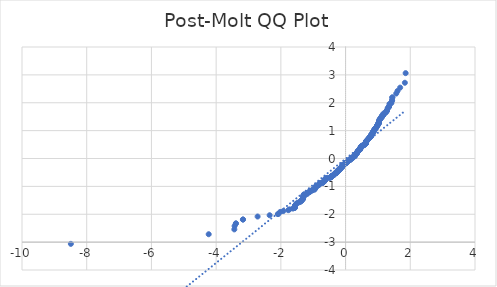
| Category | Series 0 |
|---|---|
| -0.018582954644452636 | -0.183 |
| -0.10750043838775823 | -0.273 |
| 0.8544250675625532 | 0.97 |
| 0.2643363118115212 | 0.077 |
| 0.4017542412329956 | 0.285 |
| -0.27725199826134206 | -0.512 |
| 0.3936708336199659 | 0.273 |
| 0.7089237305280515 | 0.704 |
| -0.964341645368707 | -1.112 |
| -0.32575244393950853 | -0.531 |
| 0.8948421056276923 | 1.053 |
| 0.3694206107808838 | 0.233 |
| -0.43892015052189853 | -0.649 |
| 0.8382582523364962 | 0.927 |
| 0.7412573609801633 | 0.754 |
| -0.0913336231617035 | -0.251 |
| -0.36616948200464766 | -0.589 |
| 0.04608430625977087 | -0.133 |
| -0.9562582377556796 | -1.092 |
| 1.0080098122100822 | 1.245 |
| -0.28533540587436945 | -0.518 |
| -0.6410053408475941 | -0.777 |
| -0.36616948200464766 | -0.589 |
| 0.8705918827886079 | 0.979 |
| 0.9352591436928315 | 1.092 |
| -1.3361783955679876 | -1.482 |
| 0.34517038794179944 | 0.188 |
| 0.6280896543977732 | 0.589 |
| 0.8140080294974141 | 0.861 |
| 0.4987551325893285 | 0.438 |
| 1.0322600350491644 | 1.333 |
| 0.9514259589188861 | 1.123 |
| -1.5705972163457937 | -1.769 |
| -0.08325021554867384 | -0.233 |
| 0.6200062467847459 | 0.531 |
| -0.4227533352958438 | -0.622 |
| 0.9029255132407197 | 1.063 |
| 0.9756761817579706 | 1.176 |
| 0.44217127929813466 | 0.319 |
| -0.8511739387863171 | -0.962 |
| 0.7735909914322749 | 0.784 |
| -1.3038447651158758 | -1.375 |
| 0.8382582523364962 | 0.927 |
| 0.36133720316785645 | 0.222 |
| 0.4987551325893285 | 0.438 |
| -0.6814223789127333 | -0.83 |
| -3.389363929277054 | -2.33 |
| 0.9352591436928315 | 1.092 |
| -0.36616948200464766 | -0.589 |
| -2.087935303579575 | -1.994 |
| 0.3047533498766603 | 0.138 |
| 0.3047533498766603 | 0.138 |
| -0.05091658509656439 | -0.217 |
| 0.11075156716399208 | -0.061 |
| 1.4121801928614734 | 1.994 |
| 0.4987551325893285 | 0.438 |
| 0.029917491033713845 | -0.149 |
| -0.6410053408475941 | -0.777 |
| 1.1615945568576092 | 1.551 |
| 0.11075156716399208 | -0.061 |
| 1.1050107035664152 | 1.465 |
| -1.5220967706676274 | -1.629 |
| -0.6410053408475941 | -0.777 |
| 1.8325173887389195 | 2.717 |
| 0.5553389858805223 | 0.474 |
| -0.1155838460007856 | -0.308 |
| -0.002416139418395611 | -0.172 |
| 0.23200268135940944 | 0.044 |
| 0.3047533498766603 | 0.138 |
| 1.024176627436137 | 1.269 |
| 0.07033452909885296 | -0.088 |
| 0.27241971942454857 | 0.094 |
| -0.27725199826134206 | -0.512 |
| 1.4364304157005556 | 2.082 |
| 0.6685066924629124 | 0.649 |
| 0.44217127929813466 | 0.319 |
| 0.8463416599495258 | 0.944 |
| 1.1050107035664152 | 1.465 |
| 0.2966699422636329 | 0.105 |
| 0.062251121485825595 | -0.116 |
| 0.8705918827886079 | 0.979 |
| 0.3047533498766603 | 0.138 |
| 0.7816743990453023 | 0.822 |
| -0.7056726017518177 | -0.869 |
| 1.6061819755741393 | 2.423 |
| 0.6280896543977732 | 0.589 |
| -0.13175066122684262 | -0.319 |
| -0.6490887484606215 | -0.807 |
| 0.3775040183939112 | 0.262 |
| -0.10750043838775823 | -0.273 |
| -0.7703398626560388 | -0.877 |
| 0.2966699422636329 | 0.105 |
| 0.6846735076889694 | 0.676 |
| -0.14791747645289735 | -0.325 |
| -0.24491836780923032 | -0.444 |
| -8.48999413309761 | -3.062 |
| -1.6271810696369888 | -1.796 |
| 1.0403434426621918 | 1.375 |
| 0.5795892087196067 | 0.493 |
| -1.4331792869243218 | -1.57 |
| -0.6410053408475941 | -0.777 |
| 0.22391927374638207 | 0.028 |
| -0.6490887484606215 | -0.807 |
| 0.6846735076889694 | 0.676 |
| -0.1155838460007856 | -0.308 |
| 0.7089237305280515 | 0.704 |
| 0.9029255132407197 | 1.063 |
| 0.34517038794179944 | 0.188 |
| 0.9514259589188861 | 1.123 |
| -0.32575244393950853 | -0.531 |
| 0.15925201284216087 | -0.028 |
| 0.9837595893709979 | 1.198 |
| -0.9562582377556796 | -1.092 |
| 0.7089237305280515 | 0.704 |
| -0.6490887484606215 | -0.807 |
| 0.7735909914322749 | 0.784 |
| 0.7897578066583297 | 0.846 |
| 0.886758698014665 | 1.015 |
| 0.4098376488460229 | 0.296 |
| 0.7735909914322749 | 0.784 |
| 1.024176627436137 | 1.269 |
| 0.15925201284216087 | -0.028 |
| 0.3775040183939112 | 0.262 |
| -0.38233629723070467 | -0.602 |
| -1.9262671513190186 | -1.886 |
| -0.23683496019620295 | -0.42 |
| 0.7816743990453023 | 0.822 |
| -0.16408429167895208 | -0.36 |
| -0.46317037336098293 | -0.676 |
| -0.6248385256215394 | -0.747 |
| 1.3394295243442227 | 1.854 |
| 0.4825883173632738 | 0.426 |
| -0.18025110690500912 | -0.402 |
| -0.6733389712997059 | -0.822 |
| -0.8188403083342076 | -0.936 |
| 0.4987551325893285 | 0.438 |
| -0.10750043838775823 | -0.273 |
| 0.3694206107808838 | 0.233 |
| -0.8430905311732897 | -0.953 |
| -0.9562582377556796 | -1.092 |
| -0.36616948200464766 | -0.589 |
| 0.8705918827886079 | 0.979 |
| 0.33708698032877205 | 0.183 |
| -0.6248385256215394 | -0.747 |
| 0.4583380945241894 | 0.366 |
| 0.45025468691116205 | 0.354 |
| 0.5230053554284129 | 0.462 |
| -0.058999992709591755 | -0.222 |
| 0.2400860889724391 | 0.055 |
| 0.15925201284216087 | -0.028 |
| 0.6200062467847459 | 0.531 |
| -0.8188403083342076 | -0.936 |
| -1.2957613575028486 | -1.32 |
| -0.18025110690500912 | -0.402 |
| 0.16733542045518823 | 0.006 |
| -0.44700355813492587 | -0.669 |
| -0.2610851830352873 | -0.481 |
| 0.4583380945241894 | 0.366 |
| -0.1155838460007856 | -0.308 |
| -0.487420596200065 | -0.69 |
| -1.1825936509204598 | -1.257 |
| 0.4745049097502441 | 0.414 |
| -0.6895057865257606 | -0.853 |
| -1.3038447651158758 | -1.375 |
| 0.24816949658546644 | 0.072 |
| 0.4583380945241894 | 0.366 |
| 0.5795892087196067 | 0.493 |
| -0.2610851830352873 | -0.481 |
| -1.4897631402155156 | -1.589 |
| -1.3765954336331268 | -1.533 |
| -1.3038447651158758 | -1.375 |
| -0.8835075692384288 | -0.988 |
| -0.5763380799433729 | -0.704 |
| 1.444513823313583 | 2.189 |
| -1.3200115803419317 | -1.449 |
| 0.5553389858805223 | 0.474 |
| -1.3119281727289043 | -1.419 |
| 0.9190923284667745 | 1.082 |
| -1.7322653686063503 | -1.824 |
| -0.7056726017518177 | -0.869 |
| -3.1711119237253036 | -2.189 |
| -0.9562582377556796 | -1.092 |
| -0.9562582377556796 | -1.092 |
| -0.02666636225748 | -0.194 |
| -0.487420596200065 | -0.69 |
| -0.9562582377556796 | -1.092 |
| 0.16733542045518823 | 0.006 |
| -0.6248385256215394 | -0.747 |
| 0.15925201284216087 | -0.028 |
| -0.0913336231617035 | -0.251 |
| 0.886758698014665 | 1.015 |
| -1.3765954336331268 | -1.533 |
| -1.5625138087327664 | -1.695 |
| -0.4227533352958438 | -0.622 |
| -1.2957613575028486 | -1.32 |
| -2.3466043471964655 | -2.036 |
| 0.8301748447234688 | 0.919 |
| 0.7412573609801633 | 0.754 |
| 0.3209201651027173 | 0.172 |
| 1.0726770731143036 | 1.434 |
| 0.6765901000759397 | 0.669 |
| 1.3394295243442227 | 1.854 |
| -0.44700355813492587 | -0.669 |
| -0.9320080149165954 | -1.015 |
| -1.5705972163457937 | -1.769 |
| 0.2966699422636329 | 0.105 |
| 0.7655075838192477 | 0.777 |
| -0.6490887484606215 | -0.807 |
| -0.18025110690500912 | -0.402 |
| 0.07841793671188263 | -0.072 |
| 0.7493407685931905 | 0.769 |
| -0.8188403083342076 | -0.936 |
| 0.7897578066583297 | 0.846 |
| 0.3532537955548268 | 0.205 |
| -0.3338358515525382 | -0.55 |
| -0.2045013297440912 | -0.414 |
| 1.0645936655012762 | 1.404 |
| 1.2990124862790835 | 1.796 |
| 0.44217127929813466 | 0.319 |
| 0.6685066924629124 | 0.649 |
| -0.38233629723070467 | -0.602 |
| 0.04608430625977087 | -0.133 |
| 0.22391927374638207 | 0.028 |
| 0.7816743990453023 | 0.822 |
| 0.1269183823900491 | -0.05 |
| 1.1696779644706388 | 1.609 |
| -0.02666636225748 | -0.194 |
| 0.054167713872798236 | -0.121 |
| -0.4308367429088712 | -0.635 |
| 0.15925201284216087 | -0.028 |
| 1.274762263439999 | 1.718 |
| 0.9756761817579706 | 1.176 |
| -0.8188403083342076 | -0.936 |
| 0.7331739533671359 | 0.747 |
| -0.15600088406592472 | -0.343 |
| 0.23200268135940944 | 0.044 |
| -0.9158411996905406 | -0.997 |
| 0.886758698014665 | 1.015 |
| -0.8835075692384288 | -0.988 |
| -0.4308367429088712 | -0.635 |
| -0.964341645368707 | -1.112 |
| 0.563422393493552 | 0.487 |
| 1.8567676115780039 | 3.062 |
| -3.1711119237253036 | -2.189 |
| 0.2966699422636329 | 0.105 |
| -0.36616948200464766 | -0.589 |
| -1.40084565647221 | -1.551 |
| 0.8220914371104414 | 0.869 |
| 0.6200062467847459 | 0.531 |
| 0.02183408342068648 | -0.155 |
| 0.6119228391717185 | 0.524 |
| 0.7089237305280515 | 0.704 |
| -0.08325021554867384 | -0.233 |
| 0.6361730620108006 | 0.615 |
| -0.16408429167895208 | -0.36 |
| -3.437864374955222 | -2.543 |
| -0.10750043838775823 | -0.273 |
| -1.5625138087327664 | -1.695 |
| 0.3047533498766603 | 0.138 |
| -1.1583434280813754 | -1.221 |
| 0.8463416599495258 | 0.944 |
| 0.2966699422636329 | 0.105 |
| 0.43408787168510504 | 0.314 |
| 1.2585954482139443 | 1.672 |
| 0.4017542412329956 | 0.285 |
| -4.230038321031948 | -2.717 |
| -0.15600088406592472 | -0.343 |
| -0.05091658509656439 | -0.217 |
| -1.5705972163457937 | -1.769 |
| -2.087935303579575 | -1.994 |
| 0.9352591436928315 | 1.092 |
| 1.23434522537486 | 1.65 |
| -1.2068438737595417 | -1.269 |
| 0.9999264045970526 | 1.21 |
| 0.16733542045518823 | 0.006 |
| 0.5876726163326341 | 0.512 |
| -0.8188403083342076 | -0.936 |
| -0.6652555636866785 | -0.814 |
| 1.3555963395702773 | 1.955 |
| 0.8220914371104414 | 0.869 |
| 0.4825883173632738 | 0.426 |
| -1.1098429824032088 | -1.198 |
| -1.1098429824032088 | -1.198 |
| -0.616755118008512 | -0.711 |
| 0.6280896543977732 | 0.589 |
| 1.024176627436137 | 1.269 |
| 0.8786752904016353 | 1.006 |
| 0.07033452909885296 | -0.088 |
| 1.0726770731143036 | 1.434 |
| -0.1155838460007856 | -0.308 |
| -0.24491836780923032 | -0.444 |
| 0.3532537955548268 | 0.205 |
| 0.7089237305280515 | 0.704 |
| 0.8220914371104414 | 0.869 |
| -0.8430905311732897 | -0.953 |
| -2.0232680426753524 | -1.919 |
| 1.1615945568576092 | 1.551 |
| 0.6200062467847459 | 0.531 |
| 0.8463416599495258 | 0.944 |
| -1.1825936509204598 | -1.257 |
| 0.3209201651027173 | 0.172 |
| 0.6280896543977732 | 0.589 |
| 0.3532537955548268 | 0.205 |
| -0.042833177483534726 | -0.2 |
| -0.2045013297440912 | -0.414 |
| -0.8107569007211779 | -0.894 |
| -1.3119281727289043 | -1.419 |
| 0.2400860889724391 | 0.055 |
| 0.22391927374638207 | 0.028 |
| -3.429780967342193 | -2.423 |
| -1.3361783955679876 | -1.482 |
| 0.9999264045970526 | 1.21 |
| 0.1269183823900491 | -0.05 |
| -0.6895057865257606 | -0.853 |
| 0.2400860889724391 | 0.055 |
| -0.25300177542226 | -0.45 |
| 0.8220914371104414 | 0.869 |
| -0.002416139418395611 | -0.172 |
| 0.062251121485825595 | -0.116 |
| 0.6685066924629124 | 0.649 |
| -1.0936761671771518 | -1.165 |
| -0.2691685906483147 | -0.499 |
| 0.5230053554284129 | 0.462 |
| 0.038000898646743504 | -0.138 |
| -1.1825936509204598 | -1.257 |
| -1.5220967706676274 | -1.629 |
| 0.6361730620108006 | 0.615 |
| 0.5876726163326341 | 0.512 |
| 1.4121801928614734 | 1.994 |
| -0.6248385256215394 | -0.747 |
| 0.6200062467847459 | 0.531 |
| -0.2610851830352873 | -0.481 |
| 1.5657649375090004 | 2.33 |
| 0.9514259589188861 | 1.123 |
| 0.6523398772368576 | 0.635 |
| 0.7735909914322749 | 0.784 |
| -0.2610851830352873 | -0.481 |
| 0.2643363118115212 | 0.077 |
| 1.1050107035664152 | 1.465 |
| -1.3119281727289043 | -1.419 |
| -1.0290089062729306 | -1.144 |
| -0.3338358515525382 | -0.55 |
| 0.6442564696238302 | 0.629 |
| -1.0290089062729306 | -1.144 |
| 0.3694206107808838 | 0.233 |
| -0.15600088406592472 | -0.343 |
| -0.2691685906483147 | -0.499 |
| -0.923924607303568 | -1.006 |
| 0.6200062467847459 | 0.531 |
| 0.8220914371104414 | 0.869 |
| 0.45025468691116205 | 0.354 |
| -0.18025110690500912 | -0.402 |
| 0.3936708336199659 | 0.273 |
| 0.2966699422636329 | 0.105 |
| -0.9562582377556796 | -1.092 |
| -1.7726824066714895 | -1.854 |
| 0.07841793671188263 | -0.072 |
| 1.444513823313583 | 2.189 |
| -1.1583434280813754 | -1.221 |
| 0.34517038794179944 | 0.188 |
| -0.18025110690500912 | -0.402 |
| 0.5795892087196067 | 0.493 |
| -0.4227533352958438 | -0.622 |
| -1.2957613575028486 | -1.32 |
| 0.4664215021372168 | 0.396 |
| 0.062251121485825595 | -0.116 |
| 1.0322600350491644 | 1.333 |
| 0.4179210564590503 | 0.302 |
| -0.8592573463993467 | -0.97 |
| -0.43892015052189853 | -0.649 |
| 1.0160932198231096 | 1.257 |
| 1.274762263439999 | 1.718 |
| -1.0209254986599032 | -1.123 |
| 0.16733542045518823 | 0.006 |
| 0.1269183823900491 | -0.05 |
| 0.27241971942454857 | 0.094 |
| 0.8220914371104414 | 0.869 |
| 1.2181784101488053 | 1.629 |
| 0.6846735076889694 | 0.676 |
| -1.5625138087327664 | -1.695 |
| 0.2643363118115212 | 0.077 |
| -1.3200115803419317 | -1.449 |
| -0.1155838460007856 | -0.308 |
| -0.6895057865257606 | -0.853 |
| 0.4583380945241894 | 0.366 |
| -0.12366725361381296 | -0.314 |
| -1.0694259443380696 | -1.154 |
| 1.3151793015051383 | 1.824 |
| 0.062251121485825595 | -0.116 |
| 0.7735909914322749 | 0.784 |
| 0.062251121485825595 | -0.116 |
| 1.2666788558269717 | 1.695 |
| 1.1615945568576092 | 1.551 |
| -0.2691685906483147 | -0.499 |
| 1.024176627436137 | 1.269 |
| 0.42600446407207765 | 0.308 |
| 0.44217127929813466 | 0.319 |
| 0.15925201284216087 | -0.028 |
| 1.274762263439999 | 1.718 |
| 0.4664215021372168 | 0.396 |
| -0.3338358515525382 | -0.55 |
| -1.3685120260200982 | -1.498 |
| -0.44700355813492587 | -0.669 |
| 0.07033452909885296 | -0.088 |
| -0.24491836780923032 | -0.444 |
| -0.7865066778820958 | -0.886 |
| 0.6200062467847459 | 0.531 |
| 0.886758698014665 | 1.015 |
| 0.029917491033713845 | -0.149 |
| 0.9514259589188861 | 1.123 |
| 0.7089237305280515 | 0.704 |
| 0.4745049097502441 | 0.414 |
| -0.05091658509656439 | -0.217 |
| 0.660423284849885 | 0.642 |
| -0.36616948200464766 | -0.589 |
| -0.18025110690500912 | -0.402 |
| 0.1269183823900491 | -0.05 |
| -2.718441097395745 | -2.082 |
| -1.1098429824032088 | -1.198 |
| 1.024176627436137 | 1.269 |
| 1.12117751879247 | 1.533 |
| 0.6200062467847459 | 0.531 |
| 0.9675927741449432 | 1.165 |
| -0.2610851830352873 | -0.481 |
| 0.3694206107808838 | 0.233 |
| -1.2795945422767927 | -1.282 |
| -0.24491836780923032 | -0.444 |
| -1.3038447651158758 | -1.375 |
| 0.4583380945241894 | 0.366 |
| 1.0322600350491644 | 1.333 |
| 0.4664215021372168 | 0.396 |
| -0.1155838460007856 | -0.308 |
| 1.0645936655012762 | 1.404 |
| -0.6248385256215394 | -0.747 |
| -3.389363929277054 | -2.33 |
| 1.6870160517044177 | 2.543 |
| 1.1050107035664152 | 1.465 |
| 0.44217127929813466 | 0.319 |
| -0.18025110690500912 | -0.402 |
| 0.6200062467847459 | 0.531 |
| -0.0913336231617035 | -0.251 |
| 0.3047533498766603 | 0.138 |
| 1.0484268502752214 | 1.389 |
| 0.6846735076889694 | 0.676 |
| -0.010499547031425272 | -0.177 |
| -0.5763380799433729 | -0.704 |
| -0.9562582377556796 | -1.092 |
| 0.9999264045970526 | 1.21 |
| 0.36133720316785645 | 0.222 |
| 0.44217127929813466 | 0.319 |
| 1.3394295243442227 | 1.854 |
| -0.16408429167895208 | -0.36 |
| -0.002416139418395611 | -0.172 |
| 0.3694206107808838 | 0.233 |
| 1.4364304157005556 | 2.082 |